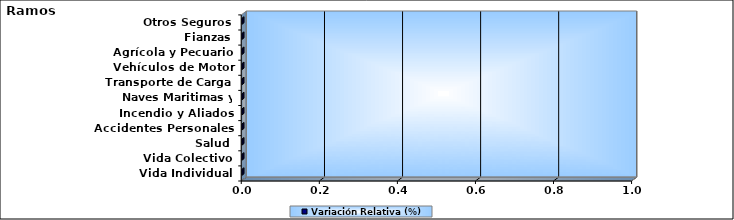
| Category | Variación Relativa (%) |
|---|---|
| Vida Individual | 0 |
| Vida Colectivo | 0 |
| Salud | 0 |
| Accidentes Personales | 0 |
| Incendio y Aliados | 0 |
| Naves Maritimas y Aéreas | 0 |
| Transporte de Carga | 0 |
| Vehículos de Motor | 0 |
| Agrícola y Pecuario | 0 |
| Fianzas | 0 |
| Otros Seguros | 0 |